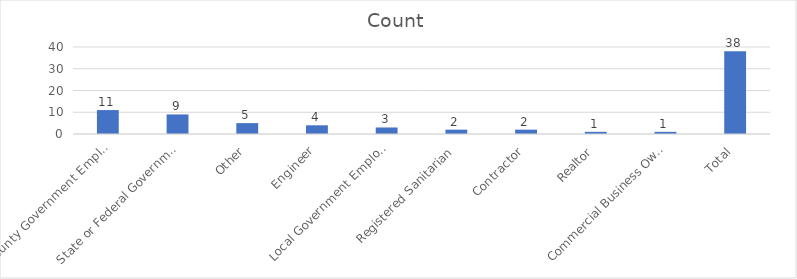
| Category | Count |
|---|---|
| County Government Employee | 11 |
| State or Federal Government Employee | 9 |
| Other | 5 |
| Engineer | 4 |
| Local Government Employee | 3 |
| Registered Sanitarian | 2 |
| Contractor | 2 |
| Realtor | 1 |
| Commercial Business Owner with onsite system | 1 |
| Total | 38 |